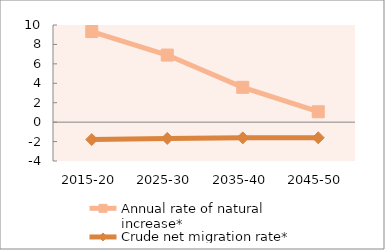
| Category | Annual rate of natural increase* | Crude net migration rate* |
|---|---|---|
| 2015-20 | 9.329 | -1.789 |
| 2025-30 | 6.906 | -1.678 |
| 2035-40 | 3.587 | -1.618 |
| 2045-50 | 1.071 | -1.608 |